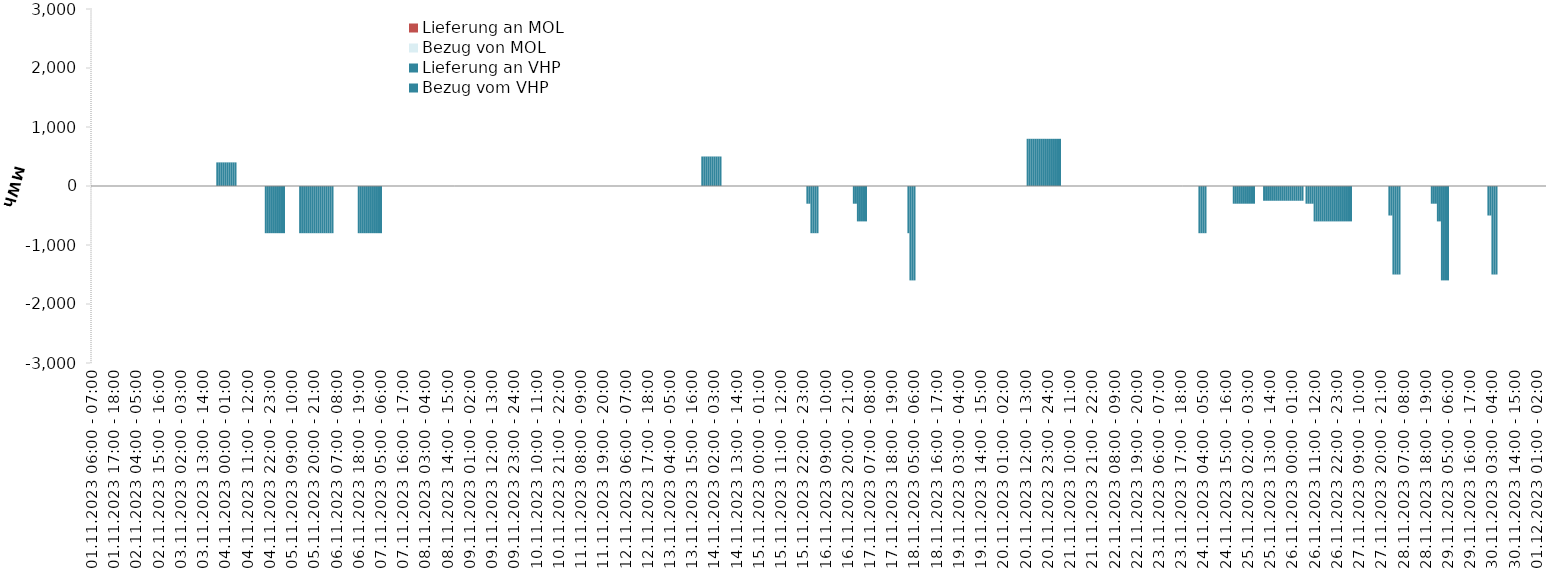
| Category | Bezug vom VHP | Lieferung an VHP | Bezug von MOL | Lieferung an MOL |
|---|---|---|---|---|
| 01.11.2023 06:00 - 07:00 | 0 | 0 | 0 | 0 |
| 01.11.2023 07:00 - 08:00 | 0 | 0 | 0 | 0 |
| 01.11.2023 08:00 - 09:00 | 0 | 0 | 0 | 0 |
| 01.11.2023 09:00 - 10:00 | 0 | 0 | 0 | 0 |
| 01.11.2023 10:00 - 11:00 | 0 | 0 | 0 | 0 |
| 01.11.2023 11:00 - 12:00 | 0 | 0 | 0 | 0 |
| 01.11.2023 12:00 - 13:00 | 0 | 0 | 0 | 0 |
| 01.11.2023 13:00 - 14:00 | 0 | 0 | 0 | 0 |
| 01.11.2023 14:00 - 15:00 | 0 | 0 | 0 | 0 |
| 01.11.2023 15:00 - 16:00 | 0 | 0 | 0 | 0 |
| 01.11.2023 16:00 - 17:00 | 0 | 0 | 0 | 0 |
| 01.11.2023 17:00 - 18:00 | 0 | 0 | 0 | 0 |
| 01.11.2023 18:00 - 19:00 | 0 | 0 | 0 | 0 |
| 01.11.2023 19:00 - 20:00 | 0 | 0 | 0 | 0 |
| 01.11.2023 20:00 - 21:00 | 0 | 0 | 0 | 0 |
| 01.11.2023 21:00 - 22:00 | 0 | 0 | 0 | 0 |
| 01.11.2023 22:00 - 23:00 | 0 | 0 | 0 | 0 |
| 01.11.2023 23:00 - 24:00 | 0 | 0 | 0 | 0 |
| 02.11.2023 00:00 - 01:00 | 0 | 0 | 0 | 0 |
| 02.11.2023 01:00 - 02:00 | 0 | 0 | 0 | 0 |
| 02.11.2023 02:00 - 03:00 | 0 | 0 | 0 | 0 |
| 02.11.2023 03:00 - 04:00 | 0 | 0 | 0 | 0 |
| 02.11.2023 04:00 - 05:00 | 0 | 0 | 0 | 0 |
| 02.11.2023 05:00 - 06:00 | 0 | 0 | 0 | 0 |
| 02.11.2023 06:00 - 07:00 | 0 | 0 | 0 | 0 |
| 02.11.2023 07:00 - 08:00 | 0 | 0 | 0 | 0 |
| 02.11.2023 08:00 - 09:00 | 0 | 0 | 0 | 0 |
| 02.11.2023 09:00 - 10:00 | 0 | 0 | 0 | 0 |
| 02.11.2023 10:00 - 11:00 | 0 | 0 | 0 | 0 |
| 02.11.2023 11:00 - 12:00 | 0 | 0 | 0 | 0 |
| 02.11.2023 12:00 - 13:00 | 0 | 0 | 0 | 0 |
| 02.11.2023 13:00 - 14:00 | 0 | 0 | 0 | 0 |
| 02.11.2023 14:00 - 15:00 | 0 | 0 | 0 | 0 |
| 02.11.2023 15:00 - 16:00 | 0 | 0 | 0 | 0 |
| 02.11.2023 16:00 - 17:00 | 0 | 0 | 0 | 0 |
| 02.11.2023 17:00 - 18:00 | 0 | 0 | 0 | 0 |
| 02.11.2023 18:00 - 19:00 | 0 | 0 | 0 | 0 |
| 02.11.2023 19:00 - 20:00 | 0 | 0 | 0 | 0 |
| 02.11.2023 20:00 - 21:00 | 0 | 0 | 0 | 0 |
| 02.11.2023 21:00 - 22:00 | 0 | 0 | 0 | 0 |
| 02.11.2023 22:00 - 23:00 | 0 | 0 | 0 | 0 |
| 02.11.2023 23:00 - 24:00 | 0 | 0 | 0 | 0 |
| 03.11.2023 00:00 - 01:00 | 0 | 0 | 0 | 0 |
| 03.11.2023 01:00 - 02:00 | 0 | 0 | 0 | 0 |
| 03.11.2023 02:00 - 03:00 | 0 | 0 | 0 | 0 |
| 03.11.2023 03:00 - 04:00 | 0 | 0 | 0 | 0 |
| 03.11.2023 04:00 - 05:00 | 0 | 0 | 0 | 0 |
| 03.11.2023 05:00 - 06:00 | 0 | 0 | 0 | 0 |
| 03.11.2023 06:00 - 07:00 | 0 | 0 | 0 | 0 |
| 03.11.2023 07:00 - 08:00 | 0 | 0 | 0 | 0 |
| 03.11.2023 08:00 - 09:00 | 0 | 0 | 0 | 0 |
| 03.11.2023 09:00 - 10:00 | 0 | 0 | 0 | 0 |
| 03.11.2023 10:00 - 11:00 | 0 | 0 | 0 | 0 |
| 03.11.2023 11:00 - 12:00 | 0 | 0 | 0 | 0 |
| 03.11.2023 12:00 - 13:00 | 0 | 0 | 0 | 0 |
| 03.11.2023 13:00 - 14:00 | 0 | 0 | 0 | 0 |
| 03.11.2023 14:00 - 15:00 | 0 | 0 | 0 | 0 |
| 03.11.2023 15:00 - 16:00 | 0 | 0 | 0 | 0 |
| 03.11.2023 16:00 - 17:00 | 0 | 0 | 0 | 0 |
| 03.11.2023 17:00 - 18:00 | 0 | 0 | 0 | 0 |
| 03.11.2023 18:00 - 19:00 | 0 | 0 | 0 | 0 |
| 03.11.2023 19:00 - 20:00 | 0 | 0 | 0 | 0 |
| 03.11.2023 20:00 - 21:00 | 400 | 0 | 0 | 0 |
| 03.11.2023 21:00 - 22:00 | 400 | 0 | 0 | 0 |
| 03.11.2023 22:00 - 23:00 | 400 | 0 | 0 | 0 |
| 03.11.2023 23:00 - 24:00 | 400 | 0 | 0 | 0 |
| 04.11.2023 00:00 - 01:00 | 400 | 0 | 0 | 0 |
| 04.11.2023 01:00 - 02:00 | 400 | 0 | 0 | 0 |
| 04.11.2023 02:00 - 03:00 | 400 | 0 | 0 | 0 |
| 04.11.2023 03:00 - 04:00 | 400 | 0 | 0 | 0 |
| 04.11.2023 04:00 - 05:00 | 400 | 0 | 0 | 0 |
| 04.11.2023 05:00 - 06:00 | 400 | 0 | 0 | 0 |
| 04.11.2023 06:00 - 07:00 | 0 | 0 | 0 | 0 |
| 04.11.2023 07:00 - 08:00 | 0 | 0 | 0 | 0 |
| 04.11.2023 08:00 - 09:00 | 0 | 0 | 0 | 0 |
| 04.11.2023 09:00 - 10:00 | 0 | 0 | 0 | 0 |
| 04.11.2023 10:00 - 11:00 | 0 | 0 | 0 | 0 |
| 04.11.2023 11:00 - 12:00 | 0 | 0 | 0 | 0 |
| 04.11.2023 12:00 - 13:00 | 0 | 0 | 0 | 0 |
| 04.11.2023 13:00 - 14:00 | 0 | 0 | 0 | 0 |
| 04.11.2023 14:00 - 15:00 | 0 | 0 | 0 | 0 |
| 04.11.2023 15:00 - 16:00 | 0 | 0 | 0 | 0 |
| 04.11.2023 16:00 - 17:00 | 0 | 0 | 0 | 0 |
| 04.11.2023 17:00 - 18:00 | 0 | 0 | 0 | 0 |
| 04.11.2023 18:00 - 19:00 | 0 | 0 | 0 | 0 |
| 04.11.2023 19:00 - 20:00 | 0 | 0 | 0 | 0 |
| 04.11.2023 20:00 - 21:00 | 0 | -800 | 0 | 0 |
| 04.11.2023 21:00 - 22:00 | 0 | -800 | 0 | 0 |
| 04.11.2023 22:00 - 23:00 | 0 | -800 | 0 | 0 |
| 04.11.2023 23:00 - 24:00 | 0 | -800 | 0 | 0 |
| 05.11.2023 00:00 - 01:00 | 0 | -800 | 0 | 0 |
| 05.11.2023 01:00 - 02:00 | 0 | -800 | 0 | 0 |
| 05.11.2023 02:00 - 03:00 | 0 | -800 | 0 | 0 |
| 05.11.2023 03:00 - 04:00 | 0 | -800 | 0 | 0 |
| 05.11.2023 04:00 - 05:00 | 0 | -800 | 0 | 0 |
| 05.11.2023 05:00 - 06:00 | 0 | -800 | 0 | 0 |
| 05.11.2023 06:00 - 07:00 | 0 | 0 | 0 | 0 |
| 05.11.2023 07:00 - 08:00 | 0 | 0 | 0 | 0 |
| 05.11.2023 08:00 - 09:00 | 0 | 0 | 0 | 0 |
| 05.11.2023 09:00 - 10:00 | 0 | 0 | 0 | 0 |
| 05.11.2023 10:00 - 11:00 | 0 | 0 | 0 | 0 |
| 05.11.2023 11:00 - 12:00 | 0 | 0 | 0 | 0 |
| 05.11.2023 12:00 - 13:00 | 0 | 0 | 0 | 0 |
| 05.11.2023 13:00 - 14:00 | 0 | -800 | 0 | 0 |
| 05.11.2023 14:00 - 15:00 | 0 | -800 | 0 | 0 |
| 05.11.2023 15:00 - 16:00 | 0 | -800 | 0 | 0 |
| 05.11.2023 16:00 - 17:00 | 0 | -800 | 0 | 0 |
| 05.11.2023 17:00 - 18:00 | 0 | -800 | 0 | 0 |
| 05.11.2023 18:00 - 19:00 | 0 | -800 | 0 | 0 |
| 05.11.2023 19:00 - 20:00 | 0 | -800 | 0 | 0 |
| 05.11.2023 20:00 - 21:00 | 0 | -800 | 0 | 0 |
| 05.11.2023 21:00 - 22:00 | 0 | -800 | 0 | 0 |
| 05.11.2023 22:00 - 23:00 | 0 | -800 | 0 | 0 |
| 05.11.2023 23:00 - 24:00 | 0 | -800 | 0 | 0 |
| 06.11.2023 00:00 - 01:00 | 0 | -800 | 0 | 0 |
| 06.11.2023 01:00 - 02:00 | 0 | -800 | 0 | 0 |
| 06.11.2023 02:00 - 03:00 | 0 | -800 | 0 | 0 |
| 06.11.2023 03:00 - 04:00 | 0 | -800 | 0 | 0 |
| 06.11.2023 04:00 - 05:00 | 0 | -800 | 0 | 0 |
| 06.11.2023 05:00 - 06:00 | 0 | -800 | 0 | 0 |
| 06.11.2023 06:00 - 07:00 | 0 | 0 | 0 | 0 |
| 06.11.2023 07:00 - 08:00 | 0 | 0 | 0 | 0 |
| 06.11.2023 08:00 - 09:00 | 0 | 0 | 0 | 0 |
| 06.11.2023 09:00 - 10:00 | 0 | 0 | 0 | 0 |
| 06.11.2023 10:00 - 11:00 | 0 | 0 | 0 | 0 |
| 06.11.2023 11:00 - 12:00 | 0 | 0 | 0 | 0 |
| 06.11.2023 12:00 - 13:00 | 0 | 0 | 0 | 0 |
| 06.11.2023 13:00 - 14:00 | 0 | 0 | 0 | 0 |
| 06.11.2023 14:00 - 15:00 | 0 | 0 | 0 | 0 |
| 06.11.2023 15:00 - 16:00 | 0 | 0 | 0 | 0 |
| 06.11.2023 16:00 - 17:00 | 0 | 0 | 0 | 0 |
| 06.11.2023 17:00 - 18:00 | 0 | 0 | 0 | 0 |
| 06.11.2023 18:00 - 19:00 | 0 | -800 | 0 | 0 |
| 06.11.2023 19:00 - 20:00 | 0 | -800 | 0 | 0 |
| 06.11.2023 20:00 - 21:00 | 0 | -800 | 0 | 0 |
| 06.11.2023 21:00 - 22:00 | 0 | -800 | 0 | 0 |
| 06.11.2023 22:00 - 23:00 | 0 | -800 | 0 | 0 |
| 06.11.2023 23:00 - 24:00 | 0 | -800 | 0 | 0 |
| 07.11.2023 00:00 - 01:00 | 0 | -800 | 0 | 0 |
| 07.11.2023 01:00 - 02:00 | 0 | -800 | 0 | 0 |
| 07.11.2023 02:00 - 03:00 | 0 | -800 | 0 | 0 |
| 07.11.2023 03:00 - 04:00 | 0 | -800 | 0 | 0 |
| 07.11.2023 04:00 - 05:00 | 0 | -800 | 0 | 0 |
| 07.11.2023 05:00 - 06:00 | 0 | -800 | 0 | 0 |
| 07.11.2023 06:00 - 07:00 | 0 | 0 | 0 | 0 |
| 07.11.2023 07:00 - 08:00 | 0 | 0 | 0 | 0 |
| 07.11.2023 08:00 - 09:00 | 0 | 0 | 0 | 0 |
| 07.11.2023 09:00 - 10:00 | 0 | 0 | 0 | 0 |
| 07.11.2023 10:00 - 11:00 | 0 | 0 | 0 | 0 |
| 07.11.2023 11:00 - 12:00 | 0 | 0 | 0 | 0 |
| 07.11.2023 12:00 - 13:00 | 0 | 0 | 0 | 0 |
| 07.11.2023 13:00 - 14:00 | 0 | 0 | 0 | 0 |
| 07.11.2023 14:00 - 15:00 | 0 | 0 | 0 | 0 |
| 07.11.2023 15:00 - 16:00 | 0 | 0 | 0 | 0 |
| 07.11.2023 16:00 - 17:00 | 0 | 0 | 0 | 0 |
| 07.11.2023 17:00 - 18:00 | 0 | 0 | 0 | 0 |
| 07.11.2023 18:00 - 19:00 | 0 | 0 | 0 | 0 |
| 07.11.2023 19:00 - 20:00 | 0 | 0 | 0 | 0 |
| 07.11.2023 20:00 - 21:00 | 0 | 0 | 0 | 0 |
| 07.11.2023 21:00 - 22:00 | 0 | 0 | 0 | 0 |
| 07.11.2023 22:00 - 23:00 | 0 | 0 | 0 | 0 |
| 07.11.2023 23:00 - 24:00 | 0 | 0 | 0 | 0 |
| 08.11.2023 00:00 - 01:00 | 0 | 0 | 0 | 0 |
| 08.11.2023 01:00 - 02:00 | 0 | 0 | 0 | 0 |
| 08.11.2023 02:00 - 03:00 | 0 | 0 | 0 | 0 |
| 08.11.2023 03:00 - 04:00 | 0 | 0 | 0 | 0 |
| 08.11.2023 04:00 - 05:00 | 0 | 0 | 0 | 0 |
| 08.11.2023 05:00 - 06:00 | 0 | 0 | 0 | 0 |
| 08.11.2023 06:00 - 07:00 | 0 | 0 | 0 | 0 |
| 08.11.2023 07:00 - 08:00 | 0 | 0 | 0 | 0 |
| 08.11.2023 08:00 - 09:00 | 0 | 0 | 0 | 0 |
| 08.11.2023 09:00 - 10:00 | 0 | 0 | 0 | 0 |
| 08.11.2023 10:00 - 11:00 | 0 | 0 | 0 | 0 |
| 08.11.2023 11:00 - 12:00 | 0 | 0 | 0 | 0 |
| 08.11.2023 12:00 - 13:00 | 0 | 0 | 0 | 0 |
| 08.11.2023 13:00 - 14:00 | 0 | 0 | 0 | 0 |
| 08.11.2023 14:00 - 15:00 | 0 | 0 | 0 | 0 |
| 08.11.2023 15:00 - 16:00 | 0 | 0 | 0 | 0 |
| 08.11.2023 16:00 - 17:00 | 0 | 0 | 0 | 0 |
| 08.11.2023 17:00 - 18:00 | 0 | 0 | 0 | 0 |
| 08.11.2023 18:00 - 19:00 | 0 | 0 | 0 | 0 |
| 08.11.2023 19:00 - 20:00 | 0 | 0 | 0 | 0 |
| 08.11.2023 20:00 - 21:00 | 0 | 0 | 0 | 0 |
| 08.11.2023 21:00 - 22:00 | 0 | 0 | 0 | 0 |
| 08.11.2023 22:00 - 23:00 | 0 | 0 | 0 | 0 |
| 08.11.2023 23:00 - 24:00 | 0 | 0 | 0 | 0 |
| 09.11.2023 00:00 - 01:00 | 0 | 0 | 0 | 0 |
| 09.11.2023 01:00 - 02:00 | 0 | 0 | 0 | 0 |
| 09.11.2023 02:00 - 03:00 | 0 | 0 | 0 | 0 |
| 09.11.2023 03:00 - 04:00 | 0 | 0 | 0 | 0 |
| 09.11.2023 04:00 - 05:00 | 0 | 0 | 0 | 0 |
| 09.11.2023 05:00 - 06:00 | 0 | 0 | 0 | 0 |
| 09.11.2023 06:00 - 07:00 | 0 | 0 | 0 | 0 |
| 09.11.2023 07:00 - 08:00 | 0 | 0 | 0 | 0 |
| 09.11.2023 08:00 - 09:00 | 0 | 0 | 0 | 0 |
| 09.11.2023 09:00 - 10:00 | 0 | 0 | 0 | 0 |
| 09.11.2023 10:00 - 11:00 | 0 | 0 | 0 | 0 |
| 09.11.2023 11:00 - 12:00 | 0 | 0 | 0 | 0 |
| 09.11.2023 12:00 - 13:00 | 0 | 0 | 0 | 0 |
| 09.11.2023 13:00 - 14:00 | 0 | 0 | 0 | 0 |
| 09.11.2023 14:00 - 15:00 | 0 | 0 | 0 | 0 |
| 09.11.2023 15:00 - 16:00 | 0 | 0 | 0 | 0 |
| 09.11.2023 16:00 - 17:00 | 0 | 0 | 0 | 0 |
| 09.11.2023 17:00 - 18:00 | 0 | 0 | 0 | 0 |
| 09.11.2023 18:00 - 19:00 | 0 | 0 | 0 | 0 |
| 09.11.2023 19:00 - 20:00 | 0 | 0 | 0 | 0 |
| 09.11.2023 20:00 - 21:00 | 0 | 0 | 0 | 0 |
| 09.11.2023 21:00 - 22:00 | 0 | 0 | 0 | 0 |
| 09.11.2023 22:00 - 23:00 | 0 | 0 | 0 | 0 |
| 09.11.2023 23:00 - 24:00 | 0 | 0 | 0 | 0 |
| 10.11.2023 00:00 - 01:00 | 0 | 0 | 0 | 0 |
| 10.11.2023 01:00 - 02:00 | 0 | 0 | 0 | 0 |
| 10.11.2023 02:00 - 03:00 | 0 | 0 | 0 | 0 |
| 10.11.2023 03:00 - 04:00 | 0 | 0 | 0 | 0 |
| 10.11.2023 04:00 - 05:00 | 0 | 0 | 0 | 0 |
| 10.11.2023 05:00 - 06:00 | 0 | 0 | 0 | 0 |
| 10.11.2023 06:00 - 07:00 | 0 | 0 | 0 | 0 |
| 10.11.2023 07:00 - 08:00 | 0 | 0 | 0 | 0 |
| 10.11.2023 08:00 - 09:00 | 0 | 0 | 0 | 0 |
| 10.11.2023 09:00 - 10:00 | 0 | 0 | 0 | 0 |
| 10.11.2023 10:00 - 11:00 | 0 | 0 | 0 | 0 |
| 10.11.2023 11:00 - 12:00 | 0 | 0 | 0 | 0 |
| 10.11.2023 12:00 - 13:00 | 0 | 0 | 0 | 0 |
| 10.11.2023 13:00 - 14:00 | 0 | 0 | 0 | 0 |
| 10.11.2023 14:00 - 15:00 | 0 | 0 | 0 | 0 |
| 10.11.2023 15:00 - 16:00 | 0 | 0 | 0 | 0 |
| 10.11.2023 16:00 - 17:00 | 0 | 0 | 0 | 0 |
| 10.11.2023 17:00 - 18:00 | 0 | 0 | 0 | 0 |
| 10.11.2023 18:00 - 19:00 | 0 | 0 | 0 | 0 |
| 10.11.2023 19:00 - 20:00 | 0 | 0 | 0 | 0 |
| 10.11.2023 20:00 - 21:00 | 0 | 0 | 0 | 0 |
| 10.11.2023 21:00 - 22:00 | 0 | 0 | 0 | 0 |
| 10.11.2023 22:00 - 23:00 | 0 | 0 | 0 | 0 |
| 10.11.2023 23:00 - 24:00 | 0 | 0 | 0 | 0 |
| 11.11.2023 00:00 - 01:00 | 0 | 0 | 0 | 0 |
| 11.11.2023 01:00 - 02:00 | 0 | 0 | 0 | 0 |
| 11.11.2023 02:00 - 03:00 | 0 | 0 | 0 | 0 |
| 11.11.2023 03:00 - 04:00 | 0 | 0 | 0 | 0 |
| 11.11.2023 04:00 - 05:00 | 0 | 0 | 0 | 0 |
| 11.11.2023 05:00 - 06:00 | 0 | 0 | 0 | 0 |
| 11.11.2023 06:00 - 07:00 | 0 | 0 | 0 | 0 |
| 11.11.2023 07:00 - 08:00 | 0 | 0 | 0 | 0 |
| 11.11.2023 08:00 - 09:00 | 0 | 0 | 0 | 0 |
| 11.11.2023 09:00 - 10:00 | 0 | 0 | 0 | 0 |
| 11.11.2023 10:00 - 11:00 | 0 | 0 | 0 | 0 |
| 11.11.2023 11:00 - 12:00 | 0 | 0 | 0 | 0 |
| 11.11.2023 12:00 - 13:00 | 0 | 0 | 0 | 0 |
| 11.11.2023 13:00 - 14:00 | 0 | 0 | 0 | 0 |
| 11.11.2023 14:00 - 15:00 | 0 | 0 | 0 | 0 |
| 11.11.2023 15:00 - 16:00 | 0 | 0 | 0 | 0 |
| 11.11.2023 16:00 - 17:00 | 0 | 0 | 0 | 0 |
| 11.11.2023 17:00 - 18:00 | 0 | 0 | 0 | 0 |
| 11.11.2023 18:00 - 19:00 | 0 | 0 | 0 | 0 |
| 11.11.2023 19:00 - 20:00 | 0 | 0 | 0 | 0 |
| 11.11.2023 20:00 - 21:00 | 0 | 0 | 0 | 0 |
| 11.11.2023 21:00 - 22:00 | 0 | 0 | 0 | 0 |
| 11.11.2023 22:00 - 23:00 | 0 | 0 | 0 | 0 |
| 11.11.2023 23:00 - 24:00 | 0 | 0 | 0 | 0 |
| 12.11.2023 00:00 - 01:00 | 0 | 0 | 0 | 0 |
| 12.11.2023 01:00 - 02:00 | 0 | 0 | 0 | 0 |
| 12.11.2023 02:00 - 03:00 | 0 | 0 | 0 | 0 |
| 12.11.2023 03:00 - 04:00 | 0 | 0 | 0 | 0 |
| 12.11.2023 04:00 - 05:00 | 0 | 0 | 0 | 0 |
| 12.11.2023 05:00 - 06:00 | 0 | 0 | 0 | 0 |
| 12.11.2023 06:00 - 07:00 | 0 | 0 | 0 | 0 |
| 12.11.2023 07:00 - 08:00 | 0 | 0 | 0 | 0 |
| 12.11.2023 08:00 - 09:00 | 0 | 0 | 0 | 0 |
| 12.11.2023 09:00 - 10:00 | 0 | 0 | 0 | 0 |
| 12.11.2023 10:00 - 11:00 | 0 | 0 | 0 | 0 |
| 12.11.2023 11:00 - 12:00 | 0 | 0 | 0 | 0 |
| 12.11.2023 12:00 - 13:00 | 0 | 0 | 0 | 0 |
| 12.11.2023 13:00 - 14:00 | 0 | 0 | 0 | 0 |
| 12.11.2023 14:00 - 15:00 | 0 | 0 | 0 | 0 |
| 12.11.2023 15:00 - 16:00 | 0 | 0 | 0 | 0 |
| 12.11.2023 16:00 - 17:00 | 0 | 0 | 0 | 0 |
| 12.11.2023 17:00 - 18:00 | 0 | 0 | 0 | 0 |
| 12.11.2023 18:00 - 19:00 | 0 | 0 | 0 | 0 |
| 12.11.2023 19:00 - 20:00 | 0 | 0 | 0 | 0 |
| 12.11.2023 20:00 - 21:00 | 0 | 0 | 0 | 0 |
| 12.11.2023 21:00 - 22:00 | 0 | 0 | 0 | 0 |
| 12.11.2023 22:00 - 23:00 | 0 | 0 | 0 | 0 |
| 12.11.2023 23:00 - 24:00 | 0 | 0 | 0 | 0 |
| 13.11.2023 00:00 - 01:00 | 0 | 0 | 0 | 0 |
| 13.11.2023 01:00 - 02:00 | 0 | 0 | 0 | 0 |
| 13.11.2023 02:00 - 03:00 | 0 | 0 | 0 | 0 |
| 13.11.2023 03:00 - 04:00 | 0 | 0 | 0 | 0 |
| 13.11.2023 04:00 - 05:00 | 0 | 0 | 0 | 0 |
| 13.11.2023 05:00 - 06:00 | 0 | 0 | 0 | 0 |
| 13.11.2023 06:00 - 07:00 | 0 | 0 | 0 | 0 |
| 13.11.2023 07:00 - 08:00 | 0 | 0 | 0 | 0 |
| 13.11.2023 08:00 - 09:00 | 0 | 0 | 0 | 0 |
| 13.11.2023 09:00 - 10:00 | 0 | 0 | 0 | 0 |
| 13.11.2023 10:00 - 11:00 | 0 | 0 | 0 | 0 |
| 13.11.2023 11:00 - 12:00 | 0 | 0 | 0 | 0 |
| 13.11.2023 12:00 - 13:00 | 0 | 0 | 0 | 0 |
| 13.11.2023 13:00 - 14:00 | 0 | 0 | 0 | 0 |
| 13.11.2023 14:00 - 15:00 | 0 | 0 | 0 | 0 |
| 13.11.2023 15:00 - 16:00 | 0 | 0 | 0 | 0 |
| 13.11.2023 16:00 - 17:00 | 0 | 0 | 0 | 0 |
| 13.11.2023 17:00 - 18:00 | 0 | 0 | 0 | 0 |
| 13.11.2023 18:00 - 19:00 | 0 | 0 | 0 | 0 |
| 13.11.2023 19:00 - 20:00 | 0 | 0 | 0 | 0 |
| 13.11.2023 20:00 - 21:00 | 500 | 0 | 0 | 0 |
| 13.11.2023 21:00 - 22:00 | 500 | 0 | 0 | 0 |
| 13.11.2023 22:00 - 23:00 | 500 | 0 | 0 | 0 |
| 13.11.2023 23:00 - 24:00 | 500 | 0 | 0 | 0 |
| 14.11.2023 00:00 - 01:00 | 500 | 0 | 0 | 0 |
| 14.11.2023 01:00 - 02:00 | 500 | 0 | 0 | 0 |
| 14.11.2023 02:00 - 03:00 | 500 | 0 | 0 | 0 |
| 14.11.2023 03:00 - 04:00 | 500 | 0 | 0 | 0 |
| 14.11.2023 04:00 - 05:00 | 500 | 0 | 0 | 0 |
| 14.11.2023 05:00 - 06:00 | 500 | 0 | 0 | 0 |
| 14.11.2023 06:00 - 07:00 | 0 | 0 | 0 | 0 |
| 14.11.2023 07:00 - 08:00 | 0 | 0 | 0 | 0 |
| 14.11.2023 08:00 - 09:00 | 0 | 0 | 0 | 0 |
| 14.11.2023 09:00 - 10:00 | 0 | 0 | 0 | 0 |
| 14.11.2023 10:00 - 11:00 | 0 | 0 | 0 | 0 |
| 14.11.2023 11:00 - 12:00 | 0 | 0 | 0 | 0 |
| 14.11.2023 12:00 - 13:00 | 0 | 0 | 0 | 0 |
| 14.11.2023 13:00 - 14:00 | 0 | 0 | 0 | 0 |
| 14.11.2023 14:00 - 15:00 | 0 | 0 | 0 | 0 |
| 14.11.2023 15:00 - 16:00 | 0 | 0 | 0 | 0 |
| 14.11.2023 16:00 - 17:00 | 0 | 0 | 0 | 0 |
| 14.11.2023 17:00 - 18:00 | 0 | 0 | 0 | 0 |
| 14.11.2023 18:00 - 19:00 | 0 | 0 | 0 | 0 |
| 14.11.2023 19:00 - 20:00 | 0 | 0 | 0 | 0 |
| 14.11.2023 20:00 - 21:00 | 0 | 0 | 0 | 0 |
| 14.11.2023 21:00 - 22:00 | 0 | 0 | 0 | 0 |
| 14.11.2023 22:00 - 23:00 | 0 | 0 | 0 | 0 |
| 14.11.2023 23:00 - 24:00 | 0 | 0 | 0 | 0 |
| 15.11.2023 00:00 - 01:00 | 0 | 0 | 0 | 0 |
| 15.11.2023 01:00 - 02:00 | 0 | 0 | 0 | 0 |
| 15.11.2023 02:00 - 03:00 | 0 | 0 | 0 | 0 |
| 15.11.2023 03:00 - 04:00 | 0 | 0 | 0 | 0 |
| 15.11.2023 04:00 - 05:00 | 0 | 0 | 0 | 0 |
| 15.11.2023 05:00 - 06:00 | 0 | 0 | 0 | 0 |
| 15.11.2023 06:00 - 07:00 | 0 | 0 | 0 | 0 |
| 15.11.2023 07:00 - 08:00 | 0 | 0 | 0 | 0 |
| 15.11.2023 08:00 - 09:00 | 0 | 0 | 0 | 0 |
| 15.11.2023 09:00 - 10:00 | 0 | 0 | 0 | 0 |
| 15.11.2023 10:00 - 11:00 | 0 | 0 | 0 | 0 |
| 15.11.2023 11:00 - 12:00 | 0 | 0 | 0 | 0 |
| 15.11.2023 12:00 - 13:00 | 0 | 0 | 0 | 0 |
| 15.11.2023 13:00 - 14:00 | 0 | 0 | 0 | 0 |
| 15.11.2023 14:00 - 15:00 | 0 | 0 | 0 | 0 |
| 15.11.2023 15:00 - 16:00 | 0 | 0 | 0 | 0 |
| 15.11.2023 16:00 - 17:00 | 0 | 0 | 0 | 0 |
| 15.11.2023 17:00 - 18:00 | 0 | 0 | 0 | 0 |
| 15.11.2023 18:00 - 19:00 | 0 | 0 | 0 | 0 |
| 15.11.2023 19:00 - 20:00 | 0 | 0 | 0 | 0 |
| 15.11.2023 20:00 - 21:00 | 0 | 0 | 0 | 0 |
| 15.11.2023 21:00 - 22:00 | 0 | 0 | 0 | 0 |
| 15.11.2023 22:00 - 23:00 | 0 | 0 | 0 | 0 |
| 15.11.2023 23:00 - 24:00 | 0 | 0 | 0 | 0 |
| 16.11.2023 00:00 - 01:00 | 0 | -300 | 0 | 0 |
| 16.11.2023 01:00 - 02:00 | 0 | -300 | 0 | 0 |
| 16.11.2023 02:00 - 03:00 | 0 | -800 | 0 | 0 |
| 16.11.2023 03:00 - 04:00 | 0 | -800 | 0 | 0 |
| 16.11.2023 04:00 - 05:00 | 0 | -800 | 0 | 0 |
| 16.11.2023 05:00 - 06:00 | 0 | -800 | 0 | 0 |
| 16.11.2023 06:00 - 07:00 | 0 | 0 | 0 | 0 |
| 16.11.2023 07:00 - 08:00 | 0 | 0 | 0 | 0 |
| 16.11.2023 08:00 - 09:00 | 0 | 0 | 0 | 0 |
| 16.11.2023 09:00 - 10:00 | 0 | 0 | 0 | 0 |
| 16.11.2023 10:00 - 11:00 | 0 | 0 | 0 | 0 |
| 16.11.2023 11:00 - 12:00 | 0 | 0 | 0 | 0 |
| 16.11.2023 12:00 - 13:00 | 0 | 0 | 0 | 0 |
| 16.11.2023 13:00 - 14:00 | 0 | 0 | 0 | 0 |
| 16.11.2023 14:00 - 15:00 | 0 | 0 | 0 | 0 |
| 16.11.2023 15:00 - 16:00 | 0 | 0 | 0 | 0 |
| 16.11.2023 16:00 - 17:00 | 0 | 0 | 0 | 0 |
| 16.11.2023 17:00 - 18:00 | 0 | 0 | 0 | 0 |
| 16.11.2023 18:00 - 19:00 | 0 | 0 | 0 | 0 |
| 16.11.2023 19:00 - 20:00 | 0 | 0 | 0 | 0 |
| 16.11.2023 20:00 - 21:00 | 0 | 0 | 0 | 0 |
| 16.11.2023 21:00 - 22:00 | 0 | 0 | 0 | 0 |
| 16.11.2023 22:00 - 23:00 | 0 | 0 | 0 | 0 |
| 16.11.2023 23:00 - 24:00 | 0 | -300 | 0 | 0 |
| 17.11.2023 00:00 - 01:00 | 0 | -300 | 0 | 0 |
| 17.11.2023 01:00 - 02:00 | 0 | -600 | 0 | 0 |
| 17.11.2023 02:00 - 03:00 | 0 | -600 | 0 | 0 |
| 17.11.2023 03:00 - 04:00 | 0 | -600 | 0 | 0 |
| 17.11.2023 04:00 - 05:00 | 0 | -600 | 0 | 0 |
| 17.11.2023 05:00 - 06:00 | 0 | -600 | 0 | 0 |
| 17.11.2023 06:00 - 07:00 | 0 | 0 | 0 | 0 |
| 17.11.2023 07:00 - 08:00 | 0 | 0 | 0 | 0 |
| 17.11.2023 08:00 - 09:00 | 0 | 0 | 0 | 0 |
| 17.11.2023 09:00 - 10:00 | 0 | 0 | 0 | 0 |
| 17.11.2023 10:00 - 11:00 | 0 | 0 | 0 | 0 |
| 17.11.2023 11:00 - 12:00 | 0 | 0 | 0 | 0 |
| 17.11.2023 12:00 - 13:00 | 0 | 0 | 0 | 0 |
| 17.11.2023 13:00 - 14:00 | 0 | 0 | 0 | 0 |
| 17.11.2023 14:00 - 15:00 | 0 | 0 | 0 | 0 |
| 17.11.2023 15:00 - 16:00 | 0 | 0 | 0 | 0 |
| 17.11.2023 16:00 - 17:00 | 0 | 0 | 0 | 0 |
| 17.11.2023 17:00 - 18:00 | 0 | 0 | 0 | 0 |
| 17.11.2023 18:00 - 19:00 | 0 | 0 | 0 | 0 |
| 17.11.2023 19:00 - 20:00 | 0 | 0 | 0 | 0 |
| 17.11.2023 20:00 - 21:00 | 0 | 0 | 0 | 0 |
| 17.11.2023 21:00 - 22:00 | 0 | 0 | 0 | 0 |
| 17.11.2023 22:00 - 23:00 | 0 | 0 | 0 | 0 |
| 17.11.2023 23:00 - 24:00 | 0 | 0 | 0 | 0 |
| 18.11.2023 00:00 - 01:00 | 0 | 0 | 0 | 0 |
| 18.11.2023 01:00 - 02:00 | 0 | 0 | 0 | 0 |
| 18.11.2023 02:00 - 03:00 | 0 | -800 | 0 | 0 |
| 18.11.2023 03:00 - 04:00 | 0 | -1600 | 0 | 0 |
| 18.11.2023 04:00 - 05:00 | 0 | -1600 | 0 | 0 |
| 18.11.2023 05:00 - 06:00 | 0 | -1600 | 0 | 0 |
| 18.11.2023 06:00 - 07:00 | 0 | 0 | 0 | 0 |
| 18.11.2023 07:00 - 08:00 | 0 | 0 | 0 | 0 |
| 18.11.2023 08:00 - 09:00 | 0 | 0 | 0 | 0 |
| 18.11.2023 09:00 - 10:00 | 0 | 0 | 0 | 0 |
| 18.11.2023 10:00 - 11:00 | 0 | 0 | 0 | 0 |
| 18.11.2023 11:00 - 12:00 | 0 | 0 | 0 | 0 |
| 18.11.2023 12:00 - 13:00 | 0 | 0 | 0 | 0 |
| 18.11.2023 13:00 - 14:00 | 0 | 0 | 0 | 0 |
| 18.11.2023 14:00 - 15:00 | 0 | 0 | 0 | 0 |
| 18.11.2023 15:00 - 16:00 | 0 | 0 | 0 | 0 |
| 18.11.2023 16:00 - 17:00 | 0 | 0 | 0 | 0 |
| 18.11.2023 17:00 - 18:00 | 0 | 0 | 0 | 0 |
| 18.11.2023 18:00 - 19:00 | 0 | 0 | 0 | 0 |
| 18.11.2023 19:00 - 20:00 | 0 | 0 | 0 | 0 |
| 18.11.2023 20:00 - 21:00 | 0 | 0 | 0 | 0 |
| 18.11.2023 21:00 - 22:00 | 0 | 0 | 0 | 0 |
| 18.11.2023 22:00 - 23:00 | 0 | 0 | 0 | 0 |
| 18.11.2023 23:00 - 24:00 | 0 | 0 | 0 | 0 |
| 19.11.2023 00:00 - 01:00 | 0 | 0 | 0 | 0 |
| 19.11.2023 01:00 - 02:00 | 0 | 0 | 0 | 0 |
| 19.11.2023 02:00 - 03:00 | 0 | 0 | 0 | 0 |
| 19.11.2023 03:00 - 04:00 | 0 | 0 | 0 | 0 |
| 19.11.2023 04:00 - 05:00 | 0 | 0 | 0 | 0 |
| 19.11.2023 05:00 - 06:00 | 0 | 0 | 0 | 0 |
| 19.11.2023 06:00 - 07:00 | 0 | 0 | 0 | 0 |
| 19.11.2023 07:00 - 08:00 | 0 | 0 | 0 | 0 |
| 19.11.2023 08:00 - 09:00 | 0 | 0 | 0 | 0 |
| 19.11.2023 09:00 - 10:00 | 0 | 0 | 0 | 0 |
| 19.11.2023 10:00 - 11:00 | 0 | 0 | 0 | 0 |
| 19.11.2023 11:00 - 12:00 | 0 | 0 | 0 | 0 |
| 19.11.2023 12:00 - 13:00 | 0 | 0 | 0 | 0 |
| 19.11.2023 13:00 - 14:00 | 0 | 0 | 0 | 0 |
| 19.11.2023 14:00 - 15:00 | 0 | 0 | 0 | 0 |
| 19.11.2023 15:00 - 16:00 | 0 | 0 | 0 | 0 |
| 19.11.2023 16:00 - 17:00 | 0 | 0 | 0 | 0 |
| 19.11.2023 17:00 - 18:00 | 0 | 0 | 0 | 0 |
| 19.11.2023 18:00 - 19:00 | 0 | 0 | 0 | 0 |
| 19.11.2023 19:00 - 20:00 | 0 | 0 | 0 | 0 |
| 19.11.2023 20:00 - 21:00 | 0 | 0 | 0 | 0 |
| 19.11.2023 21:00 - 22:00 | 0 | 0 | 0 | 0 |
| 19.11.2023 22:00 - 23:00 | 0 | 0 | 0 | 0 |
| 19.11.2023 23:00 - 24:00 | 0 | 0 | 0 | 0 |
| 20.11.2023 00:00 - 01:00 | 0 | 0 | 0 | 0 |
| 20.11.2023 01:00 - 02:00 | 0 | 0 | 0 | 0 |
| 20.11.2023 02:00 - 03:00 | 0 | 0 | 0 | 0 |
| 20.11.2023 03:00 - 04:00 | 0 | 0 | 0 | 0 |
| 20.11.2023 04:00 - 05:00 | 0 | 0 | 0 | 0 |
| 20.11.2023 05:00 - 06:00 | 0 | 0 | 0 | 0 |
| 20.11.2023 06:00 - 07:00 | 0 | 0 | 0 | 0 |
| 20.11.2023 07:00 - 08:00 | 0 | 0 | 0 | 0 |
| 20.11.2023 08:00 - 09:00 | 0 | 0 | 0 | 0 |
| 20.11.2023 09:00 - 10:00 | 0 | 0 | 0 | 0 |
| 20.11.2023 10:00 - 11:00 | 0 | 0 | 0 | 0 |
| 20.11.2023 11:00 - 12:00 | 0 | 0 | 0 | 0 |
| 20.11.2023 12:00 - 13:00 | 0 | 0 | 0 | 0 |
| 20.11.2023 13:00 - 14:00 | 800 | 0 | 0 | 0 |
| 20.11.2023 14:00 - 15:00 | 800 | 0 | 0 | 0 |
| 20.11.2023 15:00 - 16:00 | 800 | 0 | 0 | 0 |
| 20.11.2023 16:00 - 17:00 | 800 | 0 | 0 | 0 |
| 20.11.2023 17:00 - 18:00 | 800 | 0 | 0 | 0 |
| 20.11.2023 18:00 - 19:00 | 800 | 0 | 0 | 0 |
| 20.11.2023 19:00 - 20:00 | 800 | 0 | 0 | 0 |
| 20.11.2023 20:00 - 21:00 | 800 | 0 | 0 | 0 |
| 20.11.2023 21:00 - 22:00 | 800 | 0 | 0 | 0 |
| 20.11.2023 22:00 - 23:00 | 800 | 0 | 0 | 0 |
| 20.11.2023 23:00 - 24:00 | 800 | 0 | 0 | 0 |
| 21.11.2023 00:00 - 01:00 | 800 | 0 | 0 | 0 |
| 21.11.2023 01:00 - 02:00 | 800 | 0 | 0 | 0 |
| 21.11.2023 02:00 - 03:00 | 800 | 0 | 0 | 0 |
| 21.11.2023 03:00 - 04:00 | 800 | 0 | 0 | 0 |
| 21.11.2023 04:00 - 05:00 | 800 | 0 | 0 | 0 |
| 21.11.2023 05:00 - 06:00 | 800 | 0 | 0 | 0 |
| 21.11.2023 06:00 - 07:00 | 0 | 0 | 0 | 0 |
| 21.11.2023 07:00 - 08:00 | 0 | 0 | 0 | 0 |
| 21.11.2023 08:00 - 09:00 | 0 | 0 | 0 | 0 |
| 21.11.2023 09:00 - 10:00 | 0 | 0 | 0 | 0 |
| 21.11.2023 10:00 - 11:00 | 0 | 0 | 0 | 0 |
| 21.11.2023 11:00 - 12:00 | 0 | 0 | 0 | 0 |
| 21.11.2023 12:00 - 13:00 | 0 | 0 | 0 | 0 |
| 21.11.2023 13:00 - 14:00 | 0 | 0 | 0 | 0 |
| 21.11.2023 14:00 - 15:00 | 0 | 0 | 0 | 0 |
| 21.11.2023 15:00 - 16:00 | 0 | 0 | 0 | 0 |
| 21.11.2023 16:00 - 17:00 | 0 | 0 | 0 | 0 |
| 21.11.2023 17:00 - 18:00 | 0 | 0 | 0 | 0 |
| 21.11.2023 18:00 - 19:00 | 0 | 0 | 0 | 0 |
| 21.11.2023 19:00 - 20:00 | 0 | 0 | 0 | 0 |
| 21.11.2023 20:00 - 21:00 | 0 | 0 | 0 | 0 |
| 21.11.2023 21:00 - 22:00 | 0 | 0 | 0 | 0 |
| 21.11.2023 22:00 - 23:00 | 0 | 0 | 0 | 0 |
| 21.11.2023 23:00 - 24:00 | 0 | 0 | 0 | 0 |
| 22.11.2023 00:00 - 01:00 | 0 | 0 | 0 | 0 |
| 22.11.2023 01:00 - 02:00 | 0 | 0 | 0 | 0 |
| 22.11.2023 02:00 - 03:00 | 0 | 0 | 0 | 0 |
| 22.11.2023 03:00 - 04:00 | 0 | 0 | 0 | 0 |
| 22.11.2023 04:00 - 05:00 | 0 | 0 | 0 | 0 |
| 22.11.2023 05:00 - 06:00 | 0 | 0 | 0 | 0 |
| 22.11.2023 06:00 - 07:00 | 0 | 0 | 0 | 0 |
| 22.11.2023 07:00 - 08:00 | 0 | 0 | 0 | 0 |
| 22.11.2023 08:00 - 09:00 | 0 | 0 | 0 | 0 |
| 22.11.2023 09:00 - 10:00 | 0 | 0 | 0 | 0 |
| 22.11.2023 10:00 - 11:00 | 0 | 0 | 0 | 0 |
| 22.11.2023 11:00 - 12:00 | 0 | 0 | 0 | 0 |
| 22.11.2023 12:00 - 13:00 | 0 | 0 | 0 | 0 |
| 22.11.2023 13:00 - 14:00 | 0 | 0 | 0 | 0 |
| 22.11.2023 14:00 - 15:00 | 0 | 0 | 0 | 0 |
| 22.11.2023 15:00 - 16:00 | 0 | 0 | 0 | 0 |
| 22.11.2023 16:00 - 17:00 | 0 | 0 | 0 | 0 |
| 22.11.2023 17:00 - 18:00 | 0 | 0 | 0 | 0 |
| 22.11.2023 18:00 - 19:00 | 0 | 0 | 0 | 0 |
| 22.11.2023 19:00 - 20:00 | 0 | 0 | 0 | 0 |
| 22.11.2023 20:00 - 21:00 | 0 | 0 | 0 | 0 |
| 22.11.2023 21:00 - 22:00 | 0 | 0 | 0 | 0 |
| 22.11.2023 22:00 - 23:00 | 0 | 0 | 0 | 0 |
| 22.11.2023 23:00 - 24:00 | 0 | 0 | 0 | 0 |
| 23.11.2023 00:00 - 01:00 | 0 | 0 | 0 | 0 |
| 23.11.2023 01:00 - 02:00 | 0 | 0 | 0 | 0 |
| 23.11.2023 02:00 - 03:00 | 0 | 0 | 0 | 0 |
| 23.11.2023 03:00 - 04:00 | 0 | 0 | 0 | 0 |
| 23.11.2023 04:00 - 05:00 | 0 | 0 | 0 | 0 |
| 23.11.2023 05:00 - 06:00 | 0 | 0 | 0 | 0 |
| 23.11.2023 06:00 - 07:00 | 0 | 0 | 0 | 0 |
| 23.11.2023 07:00 - 08:00 | 0 | 0 | 0 | 0 |
| 23.11.2023 08:00 - 09:00 | 0 | 0 | 0 | 0 |
| 23.11.2023 09:00 - 10:00 | 0 | 0 | 0 | 0 |
| 23.11.2023 10:00 - 11:00 | 0 | 0 | 0 | 0 |
| 23.11.2023 11:00 - 12:00 | 0 | 0 | 0 | 0 |
| 23.11.2023 12:00 - 13:00 | 0 | 0 | 0 | 0 |
| 23.11.2023 13:00 - 14:00 | 0 | 0 | 0 | 0 |
| 23.11.2023 14:00 - 15:00 | 0 | 0 | 0 | 0 |
| 23.11.2023 15:00 - 16:00 | 0 | 0 | 0 | 0 |
| 23.11.2023 16:00 - 17:00 | 0 | 0 | 0 | 0 |
| 23.11.2023 17:00 - 18:00 | 0 | 0 | 0 | 0 |
| 23.11.2023 18:00 - 19:00 | 0 | 0 | 0 | 0 |
| 23.11.2023 19:00 - 20:00 | 0 | 0 | 0 | 0 |
| 23.11.2023 20:00 - 21:00 | 0 | 0 | 0 | 0 |
| 23.11.2023 21:00 - 22:00 | 0 | 0 | 0 | 0 |
| 23.11.2023 22:00 - 23:00 | 0 | 0 | 0 | 0 |
| 23.11.2023 23:00 - 24:00 | 0 | 0 | 0 | 0 |
| 24.11.2023 00:00 - 01:00 | 0 | 0 | 0 | 0 |
| 24.11.2023 01:00 - 02:00 | 0 | 0 | 0 | 0 |
| 24.11.2023 02:00 - 03:00 | 0 | -800 | 0 | 0 |
| 24.11.2023 03:00 - 04:00 | 0 | -800 | 0 | 0 |
| 24.11.2023 04:00 - 05:00 | 0 | -800 | 0 | 0 |
| 24.11.2023 05:00 - 06:00 | 0 | -800 | 0 | 0 |
| 24.11.2023 06:00 - 07:00 | 0 | 0 | 0 | 0 |
| 24.11.2023 07:00 - 08:00 | 0 | 0 | 0 | 0 |
| 24.11.2023 08:00 - 09:00 | 0 | 0 | 0 | 0 |
| 24.11.2023 09:00 - 10:00 | 0 | 0 | 0 | 0 |
| 24.11.2023 10:00 - 11:00 | 0 | 0 | 0 | 0 |
| 24.11.2023 11:00 - 12:00 | 0 | 0 | 0 | 0 |
| 24.11.2023 12:00 - 13:00 | 0 | 0 | 0 | 0 |
| 24.11.2023 13:00 - 14:00 | 0 | 0 | 0 | 0 |
| 24.11.2023 14:00 - 15:00 | 0 | 0 | 0 | 0 |
| 24.11.2023 15:00 - 16:00 | 0 | 0 | 0 | 0 |
| 24.11.2023 16:00 - 17:00 | 0 | 0 | 0 | 0 |
| 24.11.2023 17:00 - 18:00 | 0 | 0 | 0 | 0 |
| 24.11.2023 18:00 - 19:00 | 0 | 0 | 0 | 0 |
| 24.11.2023 19:00 - 20:00 | 0 | -300 | 0 | 0 |
| 24.11.2023 20:00 - 21:00 | 0 | -300 | 0 | 0 |
| 24.11.2023 21:00 - 22:00 | 0 | -300 | 0 | 0 |
| 24.11.2023 22:00 - 23:00 | 0 | -300 | 0 | 0 |
| 24.11.2023 23:00 - 24:00 | 0 | -300 | 0 | 0 |
| 25.11.2023 00:00 - 01:00 | 0 | -300 | 0 | 0 |
| 25.11.2023 01:00 - 02:00 | 0 | -300 | 0 | 0 |
| 25.11.2023 02:00 - 03:00 | 0 | -300 | 0 | 0 |
| 25.11.2023 03:00 - 04:00 | 0 | -300 | 0 | 0 |
| 25.11.2023 04:00 - 05:00 | 0 | -300 | 0 | 0 |
| 25.11.2023 05:00 - 06:00 | 0 | -300 | 0 | 0 |
| 25.11.2023 06:00 - 07:00 | 0 | 0 | 0 | 0 |
| 25.11.2023 07:00 - 08:00 | 0 | 0 | 0 | 0 |
| 25.11.2023 08:00 - 09:00 | 0 | 0 | 0 | 0 |
| 25.11.2023 09:00 - 10:00 | 0 | 0 | 0 | 0 |
| 25.11.2023 10:00 - 11:00 | 0 | -250 | 0 | 0 |
| 25.11.2023 11:00 - 12:00 | 0 | -250 | 0 | 0 |
| 25.11.2023 12:00 - 13:00 | 0 | -250 | 0 | 0 |
| 25.11.2023 13:00 - 14:00 | 0 | -250 | 0 | 0 |
| 25.11.2023 14:00 - 15:00 | 0 | -250 | 0 | 0 |
| 25.11.2023 15:00 - 16:00 | 0 | -250 | 0 | 0 |
| 25.11.2023 16:00 - 17:00 | 0 | -250 | 0 | 0 |
| 25.11.2023 17:00 - 18:00 | 0 | -250 | 0 | 0 |
| 25.11.2023 18:00 - 19:00 | 0 | -250 | 0 | 0 |
| 25.11.2023 19:00 - 20:00 | 0 | -250 | 0 | 0 |
| 25.11.2023 20:00 - 21:00 | 0 | -250 | 0 | 0 |
| 25.11.2023 21:00 - 22:00 | 0 | -250 | 0 | 0 |
| 25.11.2023 22:00 - 23:00 | 0 | -250 | 0 | 0 |
| 25.11.2023 23:00 - 24:00 | 0 | -250 | 0 | 0 |
| 26.11.2023 00:00 - 01:00 | 0 | -250 | 0 | 0 |
| 26.11.2023 01:00 - 02:00 | 0 | -250 | 0 | 0 |
| 26.11.2023 02:00 - 03:00 | 0 | -250 | 0 | 0 |
| 26.11.2023 03:00 - 04:00 | 0 | -250 | 0 | 0 |
| 26.11.2023 04:00 - 05:00 | 0 | -250 | 0 | 0 |
| 26.11.2023 05:00 - 06:00 | 0 | -250 | 0 | 0 |
| 26.11.2023 06:00 - 07:00 | 0 | 0 | 0 | 0 |
| 26.11.2023 07:00 - 08:00 | 0 | -300 | 0 | 0 |
| 26.11.2023 08:00 - 09:00 | 0 | -300 | 0 | 0 |
| 26.11.2023 09:00 - 10:00 | 0 | -300 | 0 | 0 |
| 26.11.2023 10:00 - 11:00 | 0 | -300 | 0 | 0 |
| 26.11.2023 11:00 - 12:00 | 0 | -600 | 0 | 0 |
| 26.11.2023 12:00 - 13:00 | 0 | -600 | 0 | 0 |
| 26.11.2023 13:00 - 14:00 | 0 | -600 | 0 | 0 |
| 26.11.2023 14:00 - 15:00 | 0 | -600 | 0 | 0 |
| 26.11.2023 15:00 - 16:00 | 0 | -600 | 0 | 0 |
| 26.11.2023 16:00 - 17:00 | 0 | -600 | 0 | 0 |
| 26.11.2023 17:00 - 18:00 | 0 | -600 | 0 | 0 |
| 26.11.2023 18:00 - 19:00 | 0 | -600 | 0 | 0 |
| 26.11.2023 19:00 - 20:00 | 0 | -600 | 0 | 0 |
| 26.11.2023 20:00 - 21:00 | 0 | -600 | 0 | 0 |
| 26.11.2023 21:00 - 22:00 | 0 | -600 | 0 | 0 |
| 26.11.2023 22:00 - 23:00 | 0 | -600 | 0 | 0 |
| 26.11.2023 23:00 - 24:00 | 0 | -600 | 0 | 0 |
| 27.11.2023 00:00 - 01:00 | 0 | -600 | 0 | 0 |
| 27.11.2023 01:00 - 02:00 | 0 | -600 | 0 | 0 |
| 27.11.2023 02:00 - 03:00 | 0 | -600 | 0 | 0 |
| 27.11.2023 03:00 - 04:00 | 0 | -600 | 0 | 0 |
| 27.11.2023 04:00 - 05:00 | 0 | -600 | 0 | 0 |
| 27.11.2023 05:00 - 06:00 | 0 | -600 | 0 | 0 |
| 27.11.2023 06:00 - 07:00 | 0 | 0 | 0 | 0 |
| 27.11.2023 07:00 - 08:00 | 0 | 0 | 0 | 0 |
| 27.11.2023 08:00 - 09:00 | 0 | 0 | 0 | 0 |
| 27.11.2023 09:00 - 10:00 | 0 | 0 | 0 | 0 |
| 27.11.2023 10:00 - 11:00 | 0 | 0 | 0 | 0 |
| 27.11.2023 11:00 - 12:00 | 0 | 0 | 0 | 0 |
| 27.11.2023 12:00 - 13:00 | 0 | 0 | 0 | 0 |
| 27.11.2023 13:00 - 14:00 | 0 | 0 | 0 | 0 |
| 27.11.2023 14:00 - 15:00 | 0 | 0 | 0 | 0 |
| 27.11.2023 15:00 - 16:00 | 0 | 0 | 0 | 0 |
| 27.11.2023 16:00 - 17:00 | 0 | 0 | 0 | 0 |
| 27.11.2023 17:00 - 18:00 | 0 | 0 | 0 | 0 |
| 27.11.2023 18:00 - 19:00 | 0 | 0 | 0 | 0 |
| 27.11.2023 19:00 - 20:00 | 0 | 0 | 0 | 0 |
| 27.11.2023 20:00 - 21:00 | 0 | 0 | 0 | 0 |
| 27.11.2023 21:00 - 22:00 | 0 | 0 | 0 | 0 |
| 27.11.2023 22:00 - 23:00 | 0 | 0 | 0 | 0 |
| 27.11.2023 23:00 - 24:00 | 0 | 0 | 0 | 0 |
| 28.11.2023 00:00 - 01:00 | 0 | -500 | 0 | 0 |
| 28.11.2023 01:00 - 02:00 | 0 | -500 | 0 | 0 |
| 28.11.2023 02:00 - 03:00 | 0 | -1500 | 0 | 0 |
| 28.11.2023 03:00 - 04:00 | 0 | -1500 | 0 | 0 |
| 28.11.2023 04:00 - 05:00 | 0 | -1500 | 0 | 0 |
| 28.11.2023 05:00 - 06:00 | 0 | -1500 | 0 | 0 |
| 28.11.2023 06:00 - 07:00 | 0 | 0 | 0 | 0 |
| 28.11.2023 07:00 - 08:00 | 0 | 0 | 0 | 0 |
| 28.11.2023 08:00 - 09:00 | 0 | 0 | 0 | 0 |
| 28.11.2023 09:00 - 10:00 | 0 | 0 | 0 | 0 |
| 28.11.2023 10:00 - 11:00 | 0 | 0 | 0 | 0 |
| 28.11.2023 11:00 - 12:00 | 0 | 0 | 0 | 0 |
| 28.11.2023 12:00 - 13:00 | 0 | 0 | 0 | 0 |
| 28.11.2023 13:00 - 14:00 | 0 | 0 | 0 | 0 |
| 28.11.2023 14:00 - 15:00 | 0 | 0 | 0 | 0 |
| 28.11.2023 15:00 - 16:00 | 0 | 0 | 0 | 0 |
| 28.11.2023 16:00 - 17:00 | 0 | 0 | 0 | 0 |
| 28.11.2023 17:00 - 18:00 | 0 | 0 | 0 | 0 |
| 28.11.2023 18:00 - 19:00 | 0 | 0 | 0 | 0 |
| 28.11.2023 19:00 - 20:00 | 0 | 0 | 0 | 0 |
| 28.11.2023 20:00 - 21:00 | 0 | 0 | 0 | 0 |
| 28.11.2023 21:00 - 22:00 | 0 | -300 | 0 | 0 |
| 28.11.2023 22:00 - 23:00 | 0 | -300 | 0 | 0 |
| 28.11.2023 23:00 - 24:00 | 0 | -300 | 0 | 0 |
| 29.11.2023 00:00 - 01:00 | 0 | -600 | 0 | 0 |
| 29.11.2023 01:00 - 02:00 | 0 | -600 | 0 | 0 |
| 29.11.2023 02:00 - 03:00 | 0 | -1600 | 0 | 0 |
| 29.11.2023 03:00 - 04:00 | 0 | -1600 | 0 | 0 |
| 29.11.2023 04:00 - 05:00 | 0 | -1600 | 0 | 0 |
| 29.11.2023 05:00 - 06:00 | 0 | -1600 | 0 | 0 |
| 29.11.2023 06:00 - 07:00 | 0 | 0 | 0 | 0 |
| 29.11.2023 07:00 - 08:00 | 0 | 0 | 0 | 0 |
| 29.11.2023 08:00 - 09:00 | 0 | 0 | 0 | 0 |
| 29.11.2023 09:00 - 10:00 | 0 | 0 | 0 | 0 |
| 29.11.2023 10:00 - 11:00 | 0 | 0 | 0 | 0 |
| 29.11.2023 11:00 - 12:00 | 0 | 0 | 0 | 0 |
| 29.11.2023 12:00 - 13:00 | 0 | 0 | 0 | 0 |
| 29.11.2023 13:00 - 14:00 | 0 | 0 | 0 | 0 |
| 29.11.2023 14:00 - 15:00 | 0 | 0 | 0 | 0 |
| 29.11.2023 15:00 - 16:00 | 0 | 0 | 0 | 0 |
| 29.11.2023 16:00 - 17:00 | 0 | 0 | 0 | 0 |
| 29.11.2023 17:00 - 18:00 | 0 | 0 | 0 | 0 |
| 29.11.2023 18:00 - 19:00 | 0 | 0 | 0 | 0 |
| 29.11.2023 19:00 - 20:00 | 0 | 0 | 0 | 0 |
| 29.11.2023 20:00 - 21:00 | 0 | 0 | 0 | 0 |
| 29.11.2023 21:00 - 22:00 | 0 | 0 | 0 | 0 |
| 29.11.2023 22:00 - 23:00 | 0 | 0 | 0 | 0 |
| 29.11.2023 23:00 - 24:00 | 0 | 0 | 0 | 0 |
| 30.11.2023 00:00 - 01:00 | 0 | 0 | 0 | 0 |
| 30.11.2023 01:00 - 02:00 | 0 | -500 | 0 | 0 |
| 30.11.2023 02:00 - 03:00 | 0 | -500 | 0 | 0 |
| 30.11.2023 03:00 - 04:00 | 0 | -1500 | 0 | 0 |
| 30.11.2023 04:00 - 05:00 | 0 | -1500 | 0 | 0 |
| 30.11.2023 05:00 - 06:00 | 0 | -1500 | 0 | 0 |
| 30.11.2023 06:00 - 07:00 | 0 | 0 | 0 | 0 |
| 30.11.2023 07:00 - 08:00 | 0 | 0 | 0 | 0 |
| 30.11.2023 08:00 - 09:00 | 0 | 0 | 0 | 0 |
| 30.11.2023 09:00 - 10:00 | 0 | 0 | 0 | 0 |
| 30.11.2023 10:00 - 11:00 | 0 | 0 | 0 | 0 |
| 30.11.2023 11:00 - 12:00 | 0 | 0 | 0 | 0 |
| 30.11.2023 12:00 - 13:00 | 0 | 0 | 0 | 0 |
| 30.11.2023 13:00 - 14:00 | 0 | 0 | 0 | 0 |
| 30.11.2023 14:00 - 15:00 | 0 | 0 | 0 | 0 |
| 30.11.2023 15:00 - 16:00 | 0 | 0 | 0 | 0 |
| 30.11.2023 16:00 - 17:00 | 0 | 0 | 0 | 0 |
| 30.11.2023 17:00 - 18:00 | 0 | 0 | 0 | 0 |
| 30.11.2023 18:00 - 19:00 | 0 | 0 | 0 | 0 |
| 30.11.2023 19:00 - 20:00 | 0 | 0 | 0 | 0 |
| 30.11.2023 20:00 - 21:00 | 0 | 0 | 0 | 0 |
| 30.11.2023 21:00 - 22:00 | 0 | 0 | 0 | 0 |
| 30.11.2023 22:00 - 23:00 | 0 | 0 | 0 | 0 |
| 30.11.2023 23:00 - 24:00 | 0 | 0 | 0 | 0 |
| 01.12.2023 00:00 - 01:00 | 0 | 0 | 0 | 0 |
| 01.12.2023 01:00 - 02:00 | 0 | 0 | 0 | 0 |
| 01.12.2023 02:00 - 03:00 | 0 | 0 | 0 | 0 |
| 01.12.2023 03:00 - 04:00 | 0 | 0 | 0 | 0 |
| 01.12.2023 04:00 - 05:00 | 0 | 0 | 0 | 0 |
| 01.12.2023 05:00 - 06:00 | 0 | 0 | 0 | 0 |